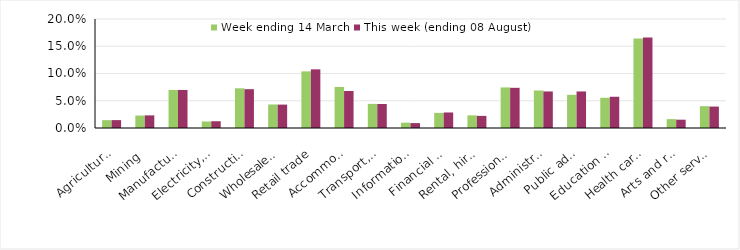
| Category | Week ending 14 March | This week (ending 08 August) |
|---|---|---|
| Agriculture, forestry and fishing | 0.014 | 0.014 |
| Mining | 0.023 | 0.023 |
| Manufacturing | 0.07 | 0.07 |
| Electricity, gas, water and waste services | 0.012 | 0.012 |
| Construction | 0.073 | 0.071 |
| Wholesale trade | 0.043 | 0.043 |
| Retail trade | 0.104 | 0.108 |
| Accommodation and food services | 0.075 | 0.068 |
| Transport, postal and warehousing | 0.044 | 0.044 |
| Information media and telecommunications | 0.01 | 0.009 |
| Financial and insurance services | 0.028 | 0.028 |
| Rental, hiring and real estate services | 0.023 | 0.022 |
| Professional, scientific and technical services | 0.074 | 0.074 |
| Administrative and support services | 0.069 | 0.067 |
| Public administration and safety | 0.061 | 0.067 |
| Education and training | 0.055 | 0.057 |
| Health care and social assistance | 0.164 | 0.166 |
| Arts and recreation services | 0.016 | 0.015 |
| Other services | 0.04 | 0.039 |